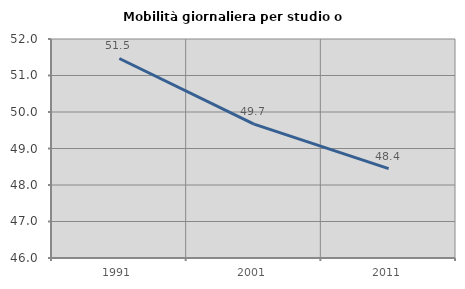
| Category | Mobilità giornaliera per studio o lavoro |
|---|---|
| 1991.0 | 51.466 |
| 2001.0 | 49.668 |
| 2011.0 | 48.447 |